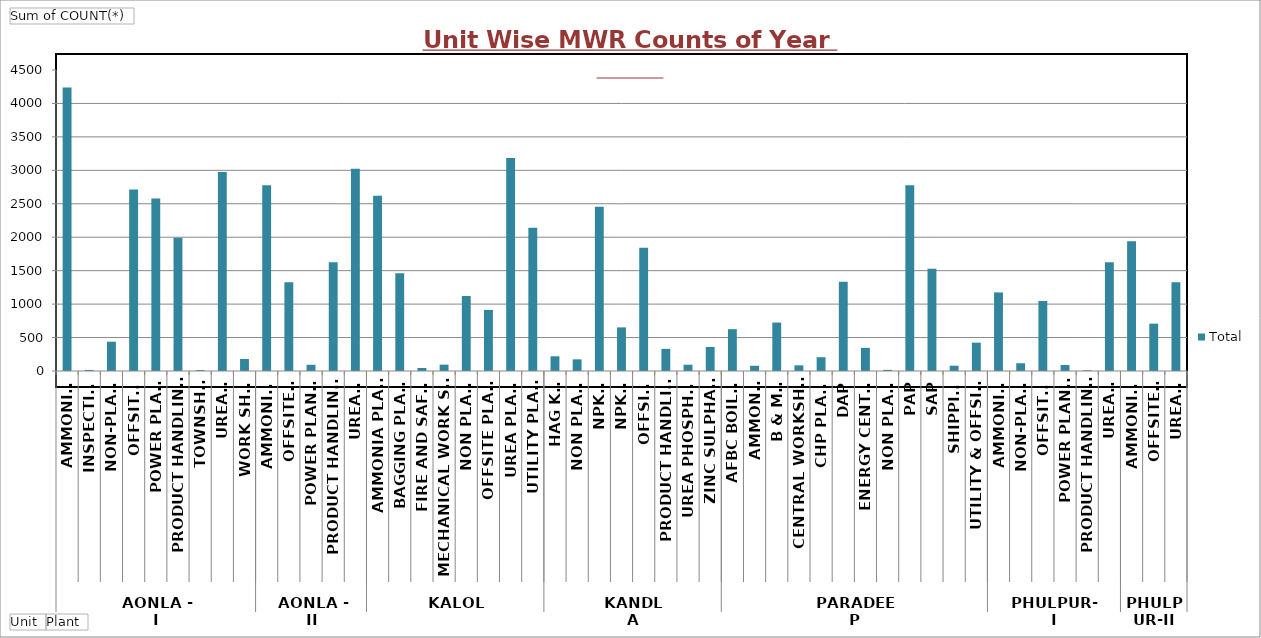
| Category | Total |
|---|---|
| 0 | 4239 |
| 1 | 16 |
| 2 | 438 |
| 3 | 2714 |
| 4 | 2580 |
| 5 | 1992 |
| 6 | 13 |
| 7 | 2975 |
| 8 | 180 |
| 9 | 2778 |
| 10 | 1326 |
| 11 | 93 |
| 12 | 1626 |
| 13 | 3023 |
| 14 | 2619 |
| 15 | 1462 |
| 16 | 45 |
| 17 | 95 |
| 18 | 1121 |
| 19 | 913 |
| 20 | 3184 |
| 21 | 2140 |
| 22 | 220 |
| 23 | 174 |
| 24 | 2457 |
| 25 | 652 |
| 26 | 1844 |
| 27 | 331 |
| 28 | 94 |
| 29 | 359 |
| 30 | 625 |
| 31 | 78 |
| 32 | 724 |
| 33 | 85 |
| 34 | 206 |
| 35 | 1336 |
| 36 | 346 |
| 37 | 17 |
| 38 | 2778 |
| 39 | 1527 |
| 40 | 79 |
| 41 | 424 |
| 42 | 1175 |
| 43 | 116 |
| 44 | 1047 |
| 45 | 90 |
| 46 | 11 |
| 47 | 1625 |
| 48 | 1941 |
| 49 | 708 |
| 50 | 1326 |